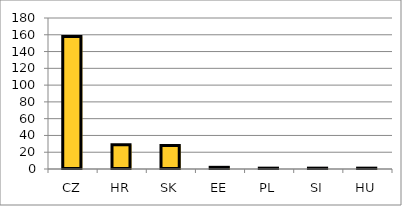
| Category | Series 0 |
|---|---|
| CZ | 158 |
| HR | 29 |
| SK | 28 |
| EE | 2 |
| PL | 1 |
| SI | 1 |
| HU | 1 |